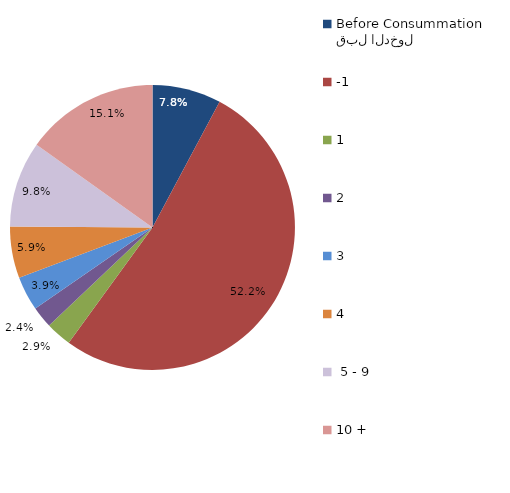
| Category | Series 0 |
|---|---|
| قبل الدخول
Before Consummation | 7.805 |
| -1 | 52.195 |
| 1 | 2.927 |
| 2 | 2.439 |
| 3 | 3.902 |
| 4 | 5.854 |
|  5 - 9 | 9.756 |
| 10 + | 15.122 |